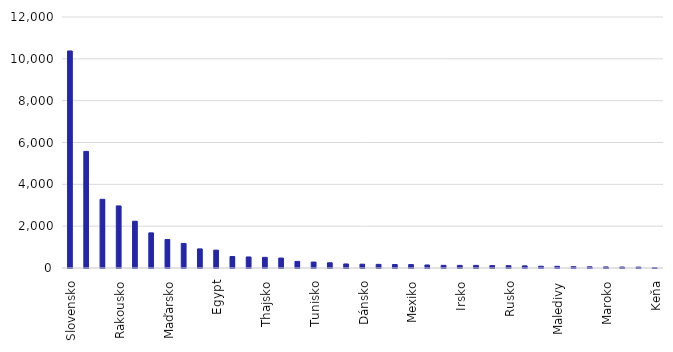
| Category | Počet Google recenzí |
|---|---|
| Slovensko | 10376 |
| Chorvatsko | 5575 |
| Itálie | 3284 |
| Rakousko | 2968 |
| Řecko | 2237 |
| Španělsko | 1680 |
| Maďarsko | 1363 |
| Německo | 1175 |
| Polsko | 913 |
| Egypt | 855 |
| Spojené království | 550 |
| Bulharsko | 528 |
| Thajsko | 510 |
| Francie | 476 |
| Srí Lanka | 316 |
| Tunisko | 285 |
| Portugalsko | 250 |
| Dominikánská rep. | 193 |
| Dánsko | 182 |
| Turecko | 174 |
| Vietnam | 167 |
| Mexiko | 163 |
| Holandsko | 144 |
| Bali | 127 |
| Irsko | 126 |
| USA | 125 |
| Švýcarsko | 114 |
| Rusko | 112 |
| Belgie | 102 |
| Zanzibar | 83 |
| Maledivy | 81 |
| SAE | 63 |
| Švédsko | 57 |
| Maroko | 51 |
| Norsko | 45 |
| Rumunsko | 42 |
| Keňa | 13 |